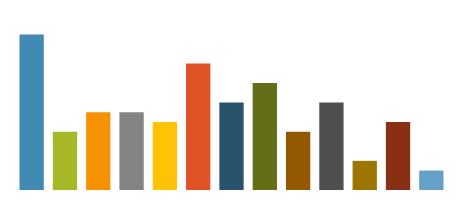
| Category | Series 0 |
|---|---|
| 0 | 16 |
| 1 | 6 |
| 2 | 8 |
| 3 | 8 |
| 4 | 7 |
| 5 | 13 |
| 6 | 9 |
| 7 | 11 |
| 8 | 6 |
| 9 | 9 |
| 10 | 3 |
| 11 | 7 |
| 12 | 2 |